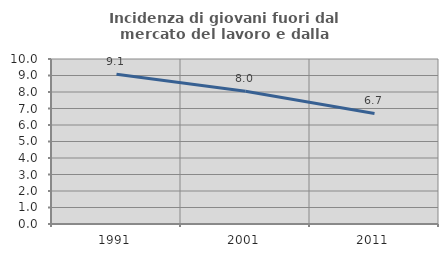
| Category | Incidenza di giovani fuori dal mercato del lavoro e dalla formazione  |
|---|---|
| 1991.0 | 9.08 |
| 2001.0 | 8.044 |
| 2011.0 | 6.698 |